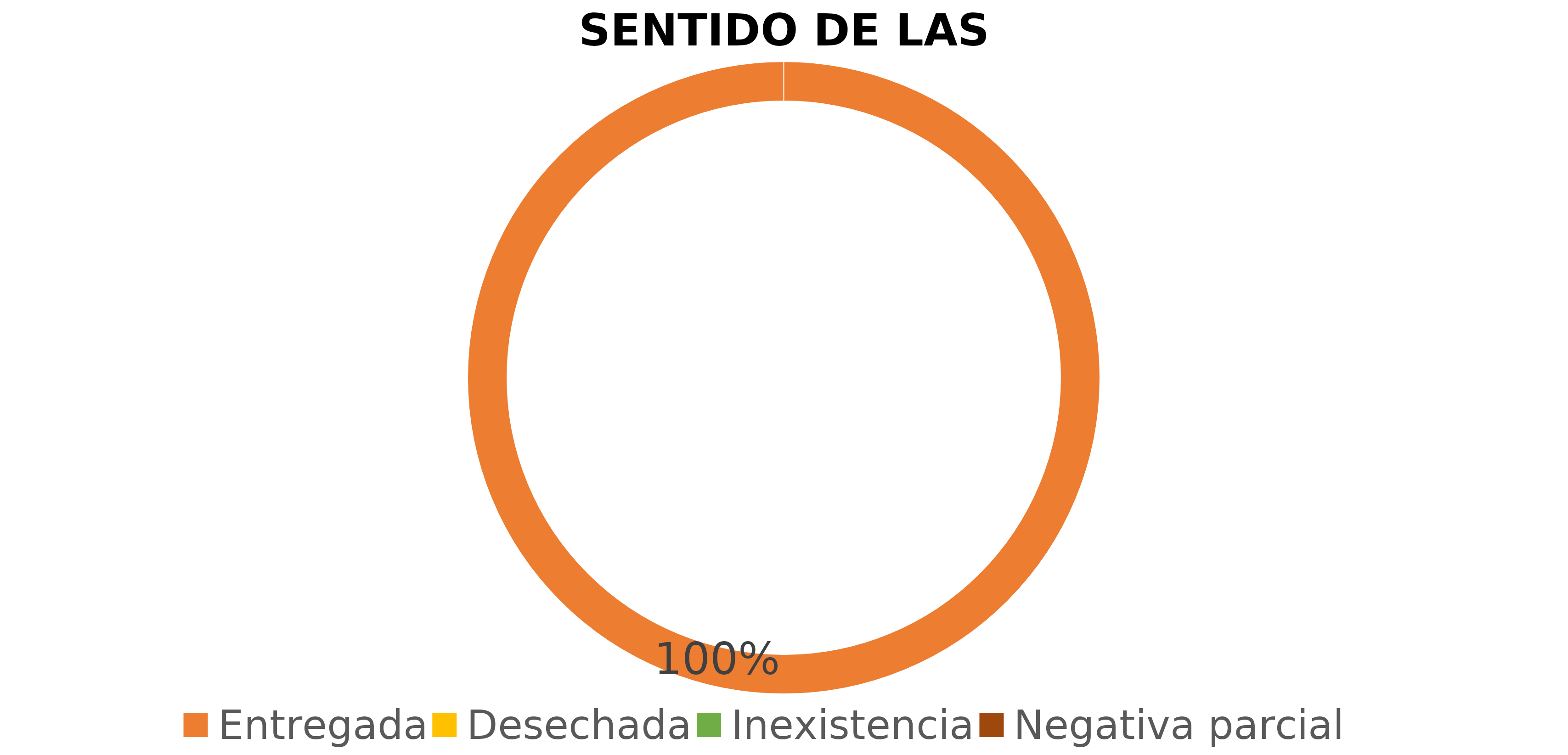
| Category | Series 0 | Series 1 |
|---|---|---|
| Entregada |  | 1 |
| Desechada |  | 0 |
| Inexistencia |  | 0 |
| Negativa parcial |  | 0 |